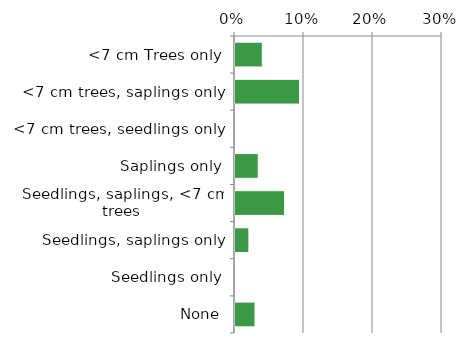
| Category | Non native |
|---|---|
| None | 0.03 |
| Seedlings only | 0 |
| Seedlings, saplings only | 0.022 |
| Seedlings, saplings, <7 cm trees | 0.073 |
| Saplings only | 0.035 |
| <7 cm trees, seedlings only | 0 |
| <7 cm trees, saplings only | 0.095 |
| <7 cm Trees only | 0.041 |